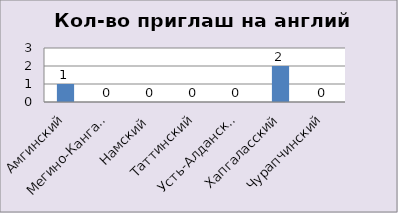
| Category | Series 0 |
|---|---|
| Амгинский | 1 |
| Мегино-Кангаласский | 0 |
| Намский | 0 |
| Таттинский | 0 |
| Усть-Алданский | 0 |
| Хапгаласский | 2 |
| Чурапчинский | 0 |